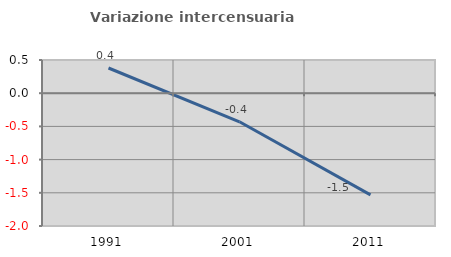
| Category | Variazione intercensuaria annua |
|---|---|
| 1991.0 | 0.38 |
| 2001.0 | -0.43 |
| 2011.0 | -1.531 |